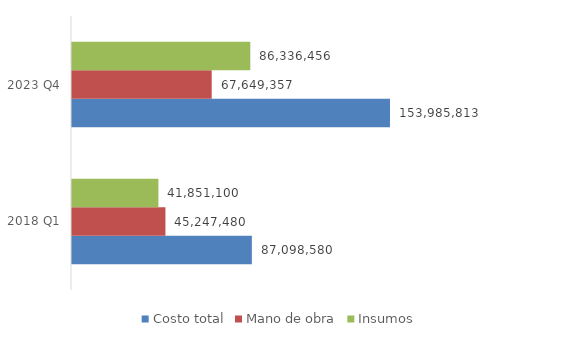
| Category | Costo total | Mano de obra | Insumos |
|---|---|---|---|
| 2018 Q1 | 87098580 | 45247480 | 41851100 |
| 2023 Q4 | 153985813.377 | 67649357 | 86336456.377 |